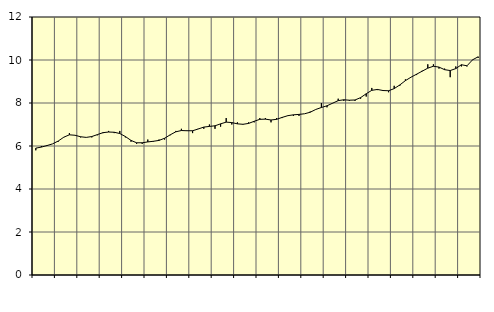
| Category | Piggar | Offentlig förvaltning m.m., SNI 84, 99 |
|---|---|---|
| nan | 5.8 | 5.9 |
| 1.0 | 6 | 5.95 |
| 1.0 | 6 | 6.02 |
| 1.0 | 6.1 | 6.1 |
| nan | 6.2 | 6.23 |
| 2.0 | 6.4 | 6.41 |
| 2.0 | 6.6 | 6.52 |
| 2.0 | 6.5 | 6.5 |
| nan | 6.4 | 6.43 |
| 3.0 | 6.4 | 6.4 |
| 3.0 | 6.4 | 6.44 |
| 3.0 | 6.5 | 6.53 |
| nan | 6.6 | 6.62 |
| 4.0 | 6.7 | 6.65 |
| 4.0 | 6.6 | 6.64 |
| 4.0 | 6.7 | 6.58 |
| nan | 6.4 | 6.44 |
| 5.0 | 6.2 | 6.26 |
| 5.0 | 6.1 | 6.15 |
| 5.0 | 6.1 | 6.15 |
| nan | 6.3 | 6.19 |
| 6.0 | 6.2 | 6.22 |
| 6.0 | 6.3 | 6.26 |
| 6.0 | 6.3 | 6.36 |
| nan | 6.5 | 6.52 |
| 7.0 | 6.7 | 6.66 |
| 7.0 | 6.8 | 6.72 |
| 7.0 | 6.7 | 6.71 |
| nan | 6.6 | 6.71 |
| 8.0 | 6.8 | 6.79 |
| 8.0 | 6.8 | 6.88 |
| 8.0 | 7 | 6.91 |
| nan | 6.8 | 6.94 |
| 9.0 | 6.9 | 7.03 |
| 9.0 | 7.3 | 7.11 |
| 9.0 | 7 | 7.09 |
| nan | 7.1 | 7.03 |
| 10.0 | 7 | 7.01 |
| 10.0 | 7.1 | 7.05 |
| 10.0 | 7.1 | 7.15 |
| nan | 7.3 | 7.24 |
| 11.0 | 7.3 | 7.25 |
| 11.0 | 7.1 | 7.21 |
| 11.0 | 7.3 | 7.24 |
| nan | 7.3 | 7.33 |
| 12.0 | 7.4 | 7.41 |
| 12.0 | 7.4 | 7.45 |
| 12.0 | 7.4 | 7.47 |
| nan | 7.5 | 7.5 |
| 13.0 | 7.6 | 7.57 |
| 13.0 | 7.7 | 7.7 |
| 13.0 | 8 | 7.79 |
| nan | 7.8 | 7.87 |
| 14.0 | 8 | 7.99 |
| 14.0 | 8.2 | 8.11 |
| 14.0 | 8.1 | 8.15 |
| nan | 8.1 | 8.13 |
| 15.0 | 8.1 | 8.14 |
| 15.0 | 8.2 | 8.25 |
| 15.0 | 8.3 | 8.43 |
| nan | 8.7 | 8.59 |
| 16.0 | 8.6 | 8.63 |
| 16.0 | 8.6 | 8.58 |
| 16.0 | 8.5 | 8.57 |
| nan | 8.8 | 8.67 |
| 17.0 | 8.8 | 8.84 |
| 17.0 | 9.1 | 9.04 |
| 17.0 | 9.2 | 9.2 |
| nan | 9.3 | 9.34 |
| 18.0 | 9.5 | 9.48 |
| 18.0 | 9.8 | 9.62 |
| 18.0 | 9.8 | 9.71 |
| nan | 9.6 | 9.67 |
| 19.0 | 9.6 | 9.55 |
| 19.0 | 9.2 | 9.51 |
| 19.0 | 9.7 | 9.6 |
| nan | 9.7 | 9.78 |
| 20.0 | 9.7 | 9.73 |
| 20.0 | 10 | 10.01 |
| 20.0 | 10.1 | 10.15 |